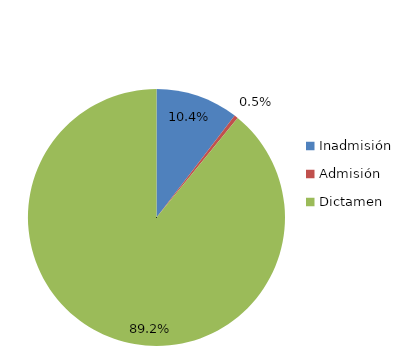
| Category | Series 0 |
|---|---|
| Inadmisión | 494 |
| Admisión | 22 |
| Dictamen | 4226 |